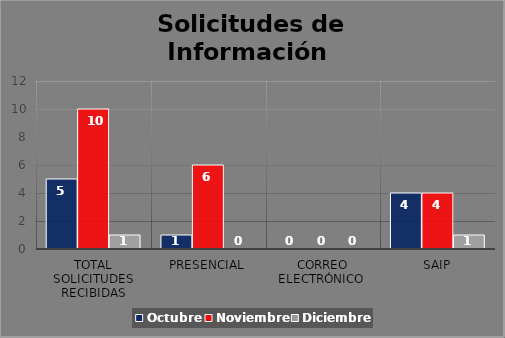
| Category | Octubre | Noviembre | Diciembre |
|---|---|---|---|
| Total Solicitudes Recibidas | 5 | 10 | 1 |
| Presencial | 1 | 6 | 0 |
| Correo Electrónico  | 0 | 0 | 0 |
| SAIP | 4 | 4 | 1 |